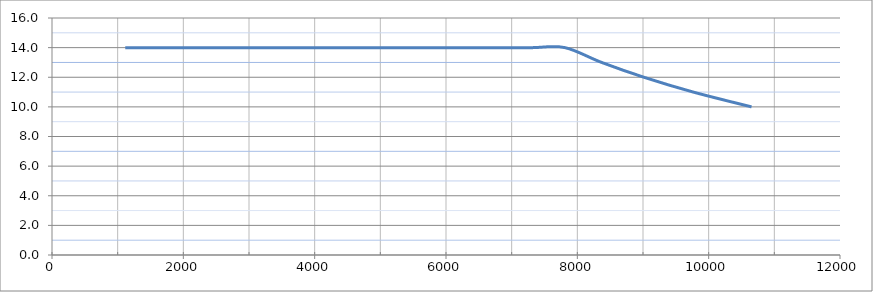
| Category | Series 0 |
|---|---|
| 10653.0 | 10 |
| 9765.0 | 11 |
| 9014.0 | 12 |
| 8370.0 | 13 |
| 7812.0 | 14 |
| 7324.0 | 14 |
| 6893.0 | 14 |
| 6510.0 | 14 |
| 6167.0 | 14 |
| 5859.0 | 14 |
| 5580.0 | 14 |
| 5326.0 | 14 |
| 5095.0 | 14 |
| 4882.0 | 14 |
| 4687.0 | 14 |
| 4507.0 | 14 |
| 4340.0 | 14 |
| 4185.0 | 14 |
| 4040.0 | 14 |
| 3906.0 | 14 |
| 3780.0 | 14 |
| 3662.0 | 14 |
| 3551.0 | 14 |
| 3446.0 | 14 |
| 3348.0 | 14 |
| 3255.0 | 14 |
| 3167.0 | 14 |
| 3083.0 | 14 |
| 3004.0 | 14 |
| 2929.0 | 14 |
| 2858.0 | 14 |
| 2790.0 | 14 |
| 2725.0 | 14 |
| 2663.0 | 14 |
| 2604.0 | 14 |
| 2547.0 | 14 |
| 2493.0 | 14 |
| 2441.0 | 14 |
| 2391.0 | 14 |
| 2343.0 | 14 |
| 2297.0 | 14 |
| 2253.0 | 14 |
| 2211.0 | 14 |
| 2170.0 | 14 |
| 2130.0 | 14 |
| 2092.0 | 14 |
| 2055.0 | 14 |
| 2020.0 | 14 |
| 1986.0 | 14 |
| 1953.0 | 14 |
| 1921.0 | 14 |
| 1890.0 | 14 |
| 1860.0 | 14 |
| 1831.0 | 14 |
| 1802.0 | 14 |
| 1775.0 | 14 |
| 1749.0 | 14 |
| 1723.0 | 14 |
| 1698.0 | 14 |
| 1674.0 | 14 |
| 1650.0 | 14 |
| 1627.0 | 14 |
| 1605.0 | 14 |
| 1583.0 | 14 |
| 1562.0 | 14 |
| 1541.0 | 14 |
| 1521.0 | 14 |
| 1502.0 | 14 |
| 1483.0 | 14 |
| 1464.0 | 14 |
| 1446.0 | 14 |
| 1429.0 | 14 |
| 1411.0 | 14 |
| 1395.0 | 14 |
| 1378.0 | 14 |
| 1362.0 | 14 |
| 1346.0 | 14 |
| 1331.0 | 14 |
| 1316.0 | 14 |
| 1302.0 | 14 |
| 1287.0 | 14 |
| 1273.0 | 14 |
| 1260.0 | 14 |
| 1246.0 | 14 |
| 1233.0 | 14 |
| 1220.0 | 14 |
| 1208.0 | 14 |
| 1195.0 | 14 |
| 1183.0 | 14 |
| 1171.0 | 14 |
| 1160.0 | 14 |
| 1148.0 | 14 |
| 1137.0 | 14 |
| 1126.0 | 14 |
| 1116.0 | 14 |